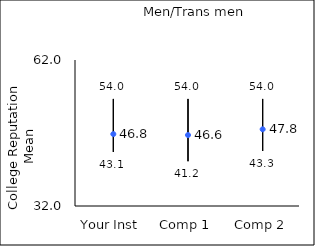
| Category | 25th percentile | 75th percentile | Mean |
|---|---|---|---|
| Your Inst | 43.1 | 54 | 46.78 |
| Comp 1 | 41.2 | 54 | 46.58 |
| Comp 2 | 43.3 | 54 | 47.76 |